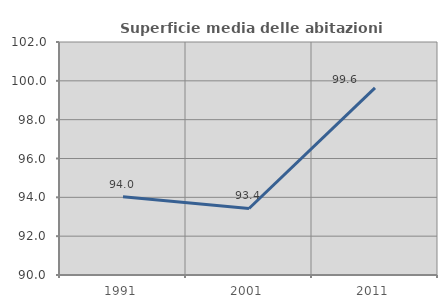
| Category | Superficie media delle abitazioni occupate |
|---|---|
| 1991.0 | 94.032 |
| 2001.0 | 93.426 |
| 2011.0 | 99.64 |